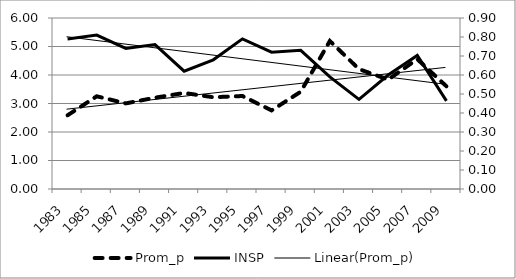
| Category | Prom_p |
|---|---|
| 1983.0 | 2.587 |
| 1985.0 | 3.253 |
| 1987.0 | 3.004 |
| 1989.0 | 3.204 |
| 1991.0 | 3.37 |
| 1993.0 | 3.22 |
| 1995.0 | 3.263 |
| 1997.0 | 2.758 |
| 1999.0 | 3.413 |
| 2001.0 | 5.193 |
| 2003.0 | 4.207 |
| 2005.0 | 3.838 |
| 2007.0 | 4.556 |
| 2009.0 | 3.604 |